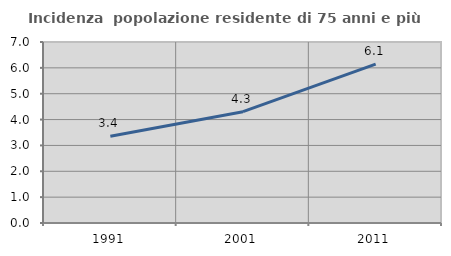
| Category | Incidenza  popolazione residente di 75 anni e più |
|---|---|
| 1991.0 | 3.358 |
| 2001.0 | 4.306 |
| 2011.0 | 6.145 |